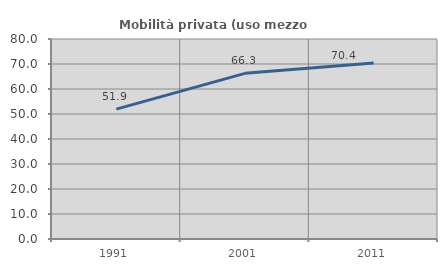
| Category | Mobilità privata (uso mezzo privato) |
|---|---|
| 1991.0 | 51.949 |
| 2001.0 | 66.264 |
| 2011.0 | 70.418 |